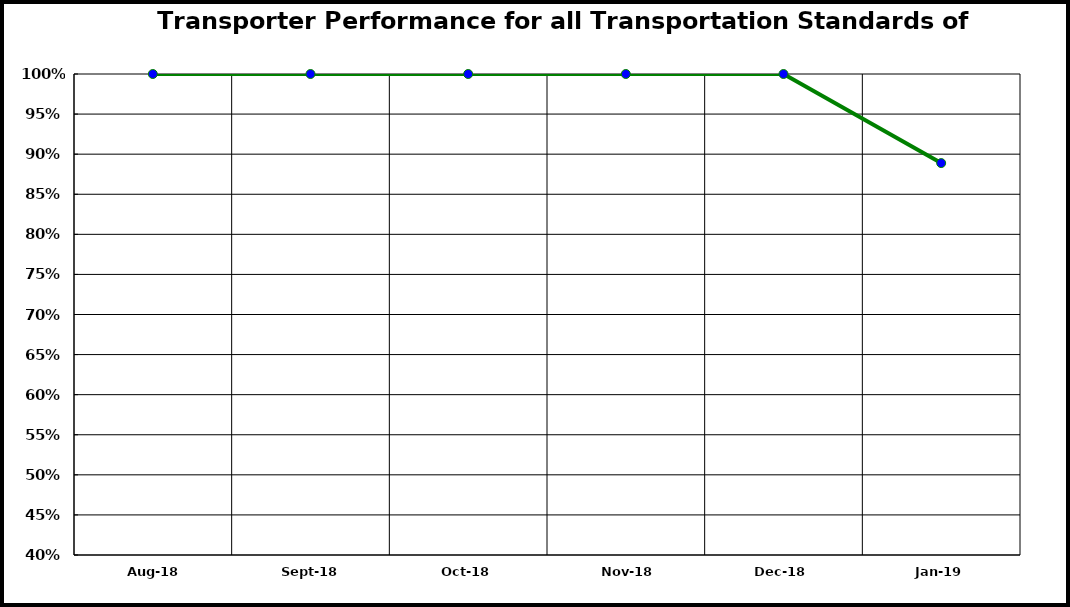
| Category | Performance |
|---|---|
| 2018-08-01 | 1 |
| 2018-09-01 | 1 |
| 2018-10-01 | 1 |
| 2018-11-01 | 1 |
| 2018-12-01 | 1 |
| 2019-01-01 | 0.889 |